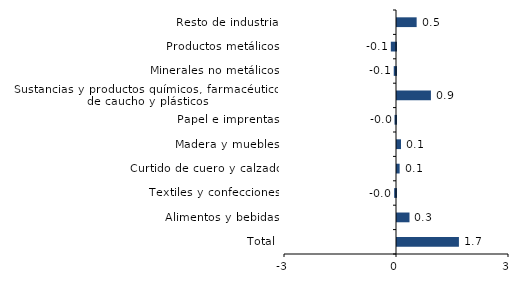
| Category | Series 0 |
|---|---|
| Total | 1.659 |
| Alimentos y bebidas | 0.335 |
| Textiles y confecciones | -0.049 |
| Curtido de cuero y calzado | 0.071 |
| Madera y muebles | 0.107 |
| Papel e imprentas | -0.04 |
| Sustancias y productos químicos, farmacéuticos, de caucho y plásticos | 0.909 |
| Minerales no metálicos | -0.061 |
| Productos metálicos | -0.138 |
| Resto de industria | 0.526 |